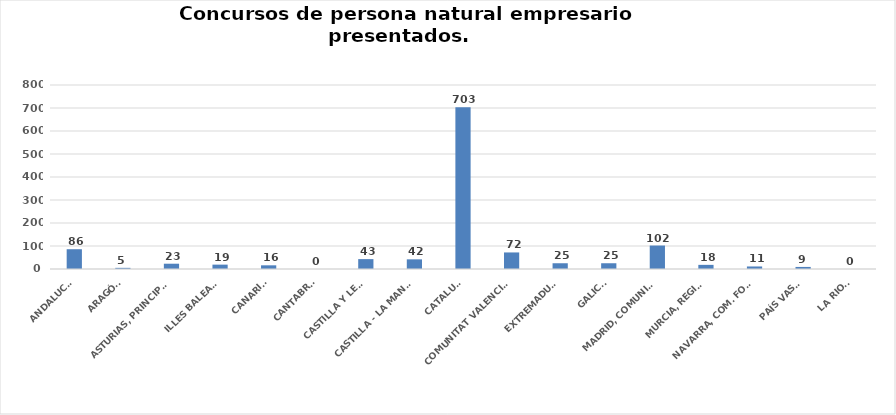
| Category | Series 0 |
|---|---|
| ANDALUCÍA | 86 |
| ARAGÓN | 5 |
| ASTURIAS, PRINCIPADO | 23 |
| ILLES BALEARS | 19 |
| CANARIAS | 16 |
| CANTABRIA | 0 |
| CASTILLA Y LEÓN | 43 |
| CASTILLA - LA MANCHA | 42 |
| CATALUÑA | 703 |
| COMUNITAT VALENCIANA | 72 |
| EXTREMADURA | 25 |
| GALICIA | 25 |
| MADRID, COMUNIDAD | 102 |
| MURCIA, REGIÓN | 18 |
| NAVARRA, COM. FORAL | 11 |
| PAÍS VASCO | 9 |
| LA RIOJA | 0 |